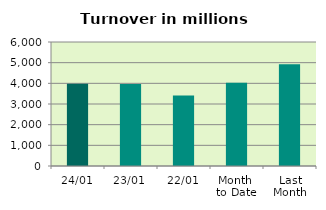
| Category | Series 0 |
|---|---|
| 24/01 | 3983.166 |
| 23/01 | 3969.171 |
| 22/01 | 3413.591 |
| Month 
to Date | 4032.406 |
| Last
Month | 4921.323 |